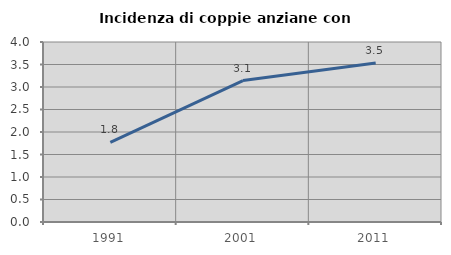
| Category | Incidenza di coppie anziane con figli |
|---|---|
| 1991.0 | 1.77 |
| 2001.0 | 3.143 |
| 2011.0 | 3.535 |